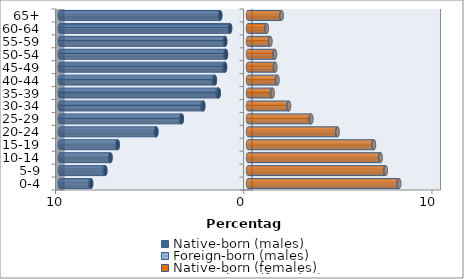
| Category | Native-born (males) | Foreign-born (males) | Native-born (females) | Foreign-born (females) |
|---|---|---|---|---|
| 0-4 | -8.332 | -0.047 | 7.992 | 0.044 |
| 5-9 | -7.579 | -0.037 | 7.287 | 0.034 |
| 10-14 | -7.302 | -0.03 | 7.021 | 0.026 |
| 15-19 | -6.92 | -0.029 | 6.67 | 0.025 |
| 20-24 | -4.867 | -0.036 | 4.734 | 0.029 |
| 25-29 | -3.515 | -0.05 | 3.332 | 0.039 |
| 30-34 | -2.373 | -0.062 | 2.138 | 0.045 |
| 35-39 | -1.553 | -0.07 | 1.27 | 0.046 |
| 40-44 | -1.758 | -0.068 | 1.533 | 0.039 |
| 45-49 | -1.218 | -0.059 | 1.428 | 0.03 |
| 50-54 | -1.171 | -0.045 | 1.414 | 0.022 |
| 55-59 | -1.211 | -0.031 | 1.174 | 0.016 |
| 60-64 | -0.951 | -0.021 | 0.984 | 0.013 |
| 65+ | -1.475 | -0.015 | 1.776 | 0.013 |